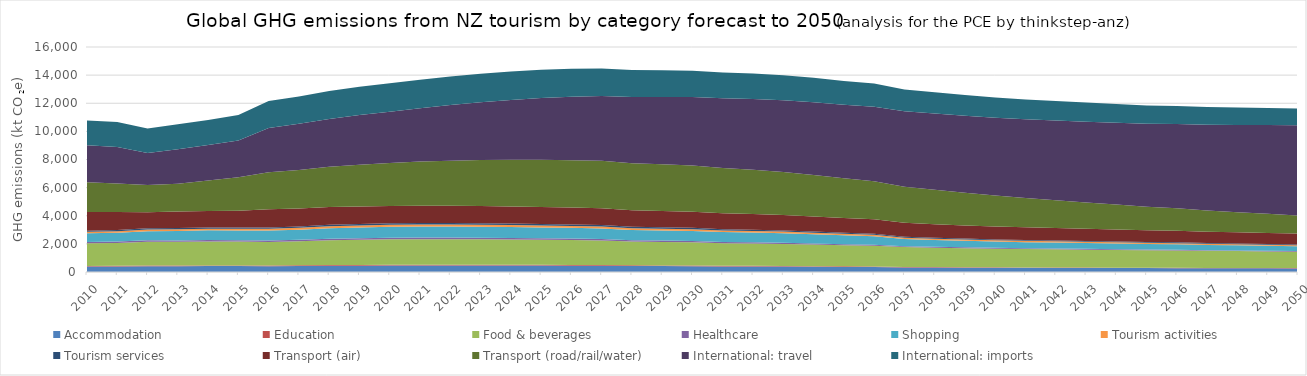
| Category | Accommodation | Education | Food & beverages | Healthcare | Shopping | Tourism activities | Tourism services | Transport (air) | Transport (road/rail/water) | International: travel | International: imports |
|---|---|---|---|---|---|---|---|---|---|---|---|
| 2010.0 | 391.498 | 43.89 | 1603.812 | 91.784 | 623.725 | 103.693 | 83.088 | 1331.723 | 2109.366 | 2622.88 | 1774.175 |
| 2011.0 | 395.865 | 44.298 | 1629.091 | 93.535 | 628.271 | 109.324 | 85.726 | 1284.792 | 2028.987 | 2590.191 | 1775.325 |
| 2012.0 | 415.193 | 47.17 | 1688.05 | 99.102 | 654.679 | 112.843 | 89.173 | 1147.441 | 1926.354 | 2286.959 | 1731.389 |
| 2013.0 | 412.615 | 45.725 | 1685.684 | 97.687 | 672.978 | 120.214 | 89.52 | 1178.887 | 1970.813 | 2448.254 | 1777.966 |
| 2014.0 | 418.96 | 45.585 | 1704.113 | 98.432 | 695.506 | 115.065 | 88.414 | 1179.231 | 2159.186 | 2522.271 | 1790.307 |
| 2015.0 | 417.825 | 45.853 | 1700.402 | 99.396 | 687.024 | 127.016 | 91.708 | 1187.043 | 2382.688 | 2612.46 | 1806.11 |
| 2016.0 | 415.998 | 45.99 | 1676.425 | 99.35 | 706.062 | 129.732 | 93.533 | 1300.617 | 2623.071 | 3150.785 | 1914.995 |
| 2017.0 | 427.591 | 48.442 | 1715.55 | 102.748 | 717.626 | 133.685 | 97.412 | 1280.977 | 2728.657 | 3286.808 | 1944.883 |
| 2018.0 | 444.584 | 51.488 | 1762.51 | 107.226 | 750.81 | 137.873 | 101.831 | 1265.596 | 2856.156 | 3403.229 | 1985.999 |
| 2019.0 | 453.245 | 53.017 | 1790.547 | 109.142 | 765.343 | 140.028 | 104.066 | 1251.151 | 2963.048 | 3538.411 | 2008.917 |
| 2020.0 | 461.005 | 54.662 | 1812.465 | 111.111 | 777.498 | 141.851 | 106.081 | 1229.638 | 3065.007 | 3634.939 | 2019.911 |
| 2021.0 | 463.041 | 55.192 | 1817.386 | 111.635 | 781.201 | 142.164 | 106.389 | 1232.292 | 3141.198 | 3799.661 | 2029.747 |
| 2022.0 | 463.279 | 55.4 | 1816.859 | 111.643 | 782.181 | 141.931 | 106.169 | 1232.107 | 3209.794 | 3958.015 | 2032.883 |
| 2023.0 | 460.85 | 55.049 | 1809.236 | 110.798 | 779.558 | 140.898 | 105.145 | 1228.305 | 3267.885 | 4109.014 | 2028.066 |
| 2024.0 | 457.726 | 54.604 | 1798.938 | 109.793 | 775.602 | 139.612 | 103.905 | 1222.989 | 3315.498 | 4254.507 | 2019.023 |
| 2025.0 | 453.569 | 54.005 | 1785.008 | 108.53 | 769.977 | 138.013 | 102.382 | 1215.932 | 3352.925 | 4393.748 | 2005.32 |
| 2026.0 | 449.048 | 53.555 | 1766.513 | 106.754 | 763.781 | 136.069 | 101.085 | 1207.881 | 3370.279 | 4502.266 | 1988.839 |
| 2027.0 | 443.548 | 52.932 | 1744.921 | 104.762 | 755.933 | 133.834 | 99.476 | 1197.965 | 3374.819 | 4603.313 | 1967.754 |
| 2028.0 | 423.86 | 48.975 | 1688.75 | 98.1 | 731.876 | 127.894 | 93.651 | 1175.711 | 3352.462 | 4696.136 | 1920.973 |
| 2029.0 | 419.191 | 48.584 | 1668.18 | 96.555 | 723.853 | 125.754 | 92.172 | 1164.264 | 3330.16 | 4781.544 | 1895.564 |
| 2030.0 | 415.1 | 48.382 | 1647.798 | 95.249 | 716.272 | 123.949 | 91.186 | 1151.957 | 3288.966 | 4858.941 | 1868.677 |
| 2031.0 | 399.2 | 44.805 | 1606.607 | 89.578 | 697.115 | 119.228 | 86.265 | 1128.603 | 3226.532 | 4948.803 | 1832.948 |
| 2032.0 | 393.728 | 43.799 | 1588.747 | 87.529 | 689.523 | 117.127 | 84.457 | 1113.388 | 3154.105 | 5030.5 | 1810.712 |
| 2033.0 | 386.826 | 42.578 | 1566.577 | 85.106 | 678.766 | 114.611 | 82.241 | 1095.695 | 3061.484 | 5103.839 | 1782.128 |
| 2034.0 | 375.39 | 40.758 | 1533.601 | 81.648 | 654.963 | 111.363 | 79.156 | 1072.932 | 2948.174 | 5168.862 | 1739.117 |
| 2035.0 | 362.785 | 38.725 | 1496.822 | 77.919 | 629.529 | 107.801 | 75.741 | 1048.774 | 2826.854 | 5225.889 | 1692.028 |
| 2036.0 | 352.394 | 36.899 | 1468.932 | 74.514 | 608.138 | 104.916 | 72.943 | 1025.746 | 2707.749 | 5298.015 | 1655.432 |
| 2037.0 | 327.296 | 32.714 | 1411.074 | 67.902 | 504.883 | 99.652 | 67.365 | 985.191 | 2566.651 | 5362.873 | 1557.943 |
| 2038.0 | 317.013 | 31.235 | 1382.205 | 64.895 | 478.645 | 97.246 | 65.23 | 961.008 | 2443.125 | 5421.635 | 1515.047 |
| 2039.0 | 308.603 | 29.966 | 1355.032 | 62.352 | 461.808 | 94.936 | 63.332 | 939.503 | 2319.684 | 5475.672 | 1477.746 |
| 2040.0 | 300.642 | 28.856 | 1328.179 | 60.013 | 445.056 | 92.718 | 61.585 | 918.455 | 2198.635 | 5526.466 | 1439.706 |
| 2041.0 | 295.124 | 28.044 | 1311.098 | 58.139 | 431.812 | 91.203 | 60.432 | 899.72 | 2087.633 | 5599.25 | 1412.618 |
| 2042.0 | 290.861 | 27.433 | 1294.746 | 56.623 | 424.202 | 89.773 | 59.484 | 883.161 | 1980.23 | 5670.824 | 1388.422 |
| 2043.0 | 286.059 | 26.782 | 1277.32 | 55.045 | 415.263 | 88.229 | 58.425 | 866.63 | 1876.45 | 5742.466 | 1361.868 |
| 2044.0 | 281.118 | 26.112 | 1259.452 | 53.455 | 405.789 | 86.597 | 57.295 | 850.589 | 1776.432 | 5815.226 | 1333.989 |
| 2045.0 | 276.027 | 25.47 | 1240.584 | 51.904 | 396.044 | 84.937 | 56.159 | 835.289 | 1680.843 | 5889.899 | 1305.196 |
| 2046.0 | 272.973 | 25.018 | 1230.485 | 50.651 | 389.246 | 83.847 | 55.471 | 822.227 | 1595.255 | 5992.44 | 1286.551 |
| 2047.0 | 266.364 | 24.129 | 1214.03 | 48.694 | 369.248 | 82.323 | 54.174 | 806.38 | 1512.149 | 6097.074 | 1256.361 |
| 2048.0 | 262.353 | 23.561 | 1199.709 | 47.323 | 361.279 | 80.972 | 53.247 | 794.214 | 1433.338 | 6203.988 | 1234.19 |
| 2049.0 | 258.058 | 22.987 | 1183.873 | 45.954 | 352.987 | 79.559 | 52.273 | 782.59 | 1357.878 | 6313.202 | 1210.879 |
| 2050.0 | 253.34 | 22.367 | 1166.266 | 44.54 | 344.253 | 78.055 | 51.208 | 771.339 | 1285.724 | 6424.609 | 1186.387 |